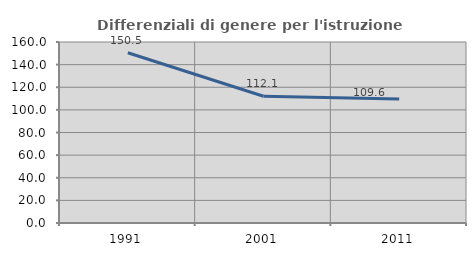
| Category | Differenziali di genere per l'istruzione superiore |
|---|---|
| 1991.0 | 150.506 |
| 2001.0 | 112.053 |
| 2011.0 | 109.604 |